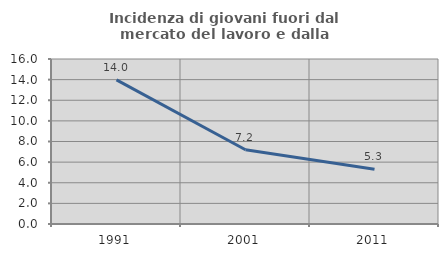
| Category | Incidenza di giovani fuori dal mercato del lavoro e dalla formazione  |
|---|---|
| 1991.0 | 13.978 |
| 2001.0 | 7.2 |
| 2011.0 | 5.31 |